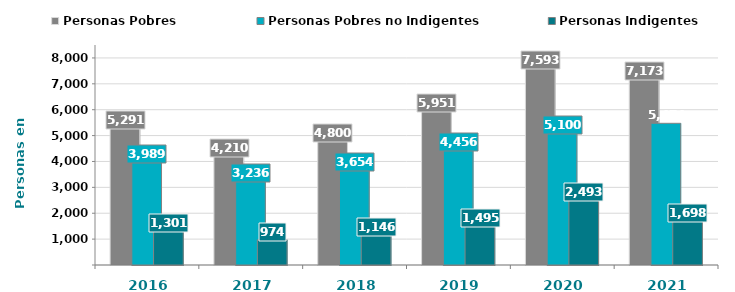
| Category | Personas Pobres | Personas Pobres no Indigentes | Personas Indigentes |
|---|---|---|---|
| 2016.0 | 5290577 | 3989117 | 1301460 |
| 2017.0 | 4210197 | 3236426 | 973771 |
| 2018.0 | 4799889 | 3654077 | 1145812 |
| 2019.0 | 5951015 | 4455773 | 1495242 |
| 2020.0 | 7592737 | 5099891 | 2492846 |
| 2021.0 | 7172648 | 5474441 | 1698207 |